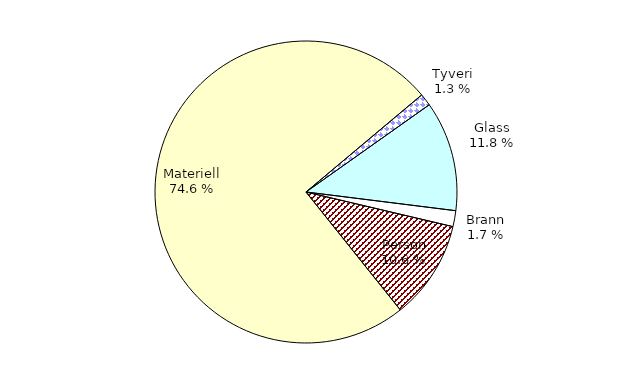
| Category | Series 0 |
|---|---|
| Tyveri | 92.778 |
| Glass | 835.247 |
| Brann | 121.011 |
| Person | 749.953 |
| Materiell | 5290.252 |